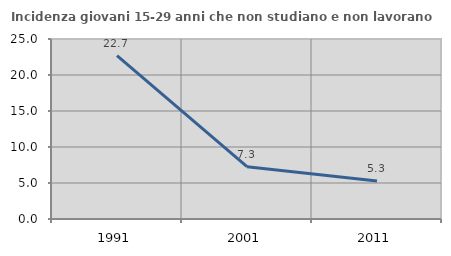
| Category | Incidenza giovani 15-29 anni che non studiano e non lavorano  |
|---|---|
| 1991.0 | 22.678 |
| 2001.0 | 7.273 |
| 2011.0 | 5.263 |